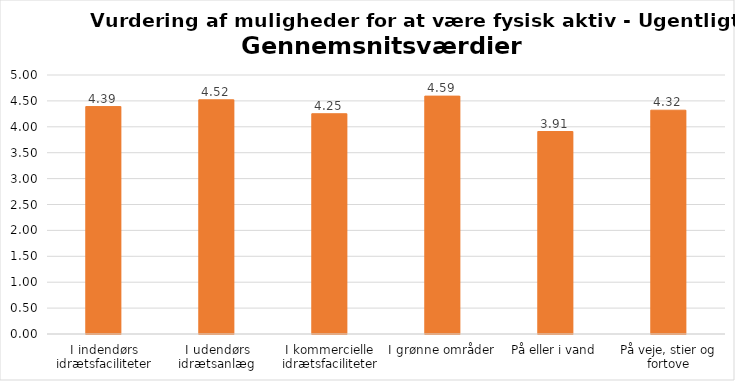
| Category | Gennemsnit |
|---|---|
| I indendørs idrætsfaciliteter | 4.391 |
| I udendørs idrætsanlæg | 4.521 |
| I kommercielle idrætsfaciliteter | 4.252 |
| I grønne områder | 4.592 |
| På eller i vand | 3.909 |
| På veje, stier og fortove | 4.32 |